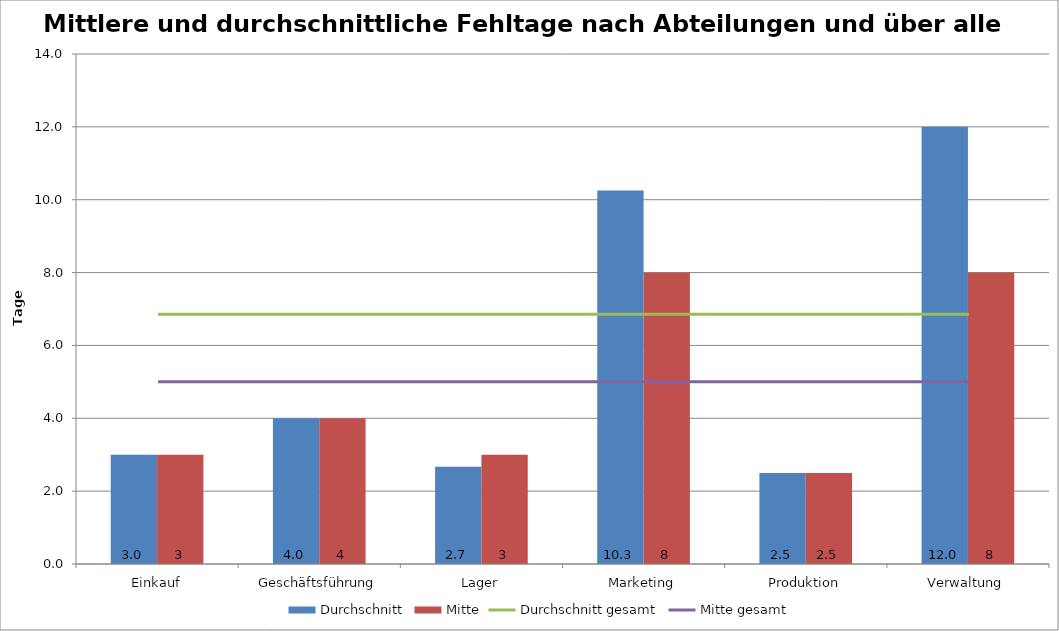
| Category | Durchschnitt | Mitte |
|---|---|---|
| Einkauf | 3 | 3 |
| Geschäftsführung | 4 | 4 |
| Lager | 2.667 | 3 |
| Marketing | 10.25 | 8 |
| Produktion | 2.5 | 2.5 |
| Verwaltung | 12 | 8 |